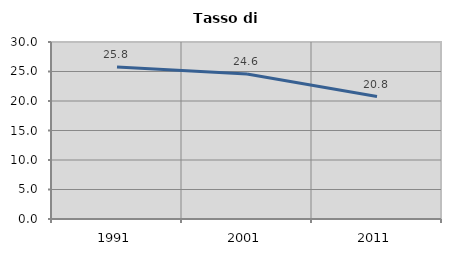
| Category | Tasso di disoccupazione   |
|---|---|
| 1991.0 | 25.758 |
| 2001.0 | 24.561 |
| 2011.0 | 20.755 |